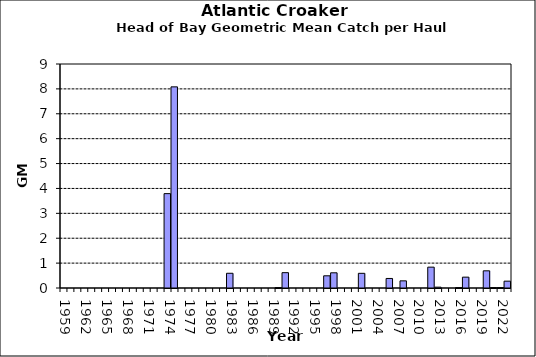
| Category | Series 0 |
|---|---|
| 1959.0 | 0 |
| 1960.0 | 0 |
| 1961.0 | 0 |
| 1962.0 | 0 |
| 1963.0 | 0 |
| 1964.0 | 0 |
| 1965.0 | 0 |
| 1966.0 | 0 |
| 1967.0 | 0 |
| 1968.0 | 0 |
| 1969.0 | 0 |
| 1970.0 | 0 |
| 1971.0 | 0 |
| 1972.0 | 0 |
| 1973.0 | 0 |
| 1974.0 | 3.792 |
| 1975.0 | 8.081 |
| 1976.0 | 0 |
| 1977.0 | 0 |
| 1978.0 | 0 |
| 1979.0 | 0 |
| 1980.0 | 0 |
| 1981.0 | 0 |
| 1982.0 | 0 |
| 1983.0 | 0.592 |
| 1984.0 | 0 |
| 1985.0 | 0 |
| 1986.0 | 0 |
| 1987.0 | 0 |
| 1988.0 | 0 |
| 1989.0 | 0 |
| 1990.0 | 0.017 |
| 1991.0 | 0.616 |
| 1992.0 | 0 |
| 1993.0 | 0 |
| 1994.0 | 0 |
| 1995.0 | 0 |
| 1996.0 | 0 |
| 1997.0 | 0.49 |
| 1998.0 | 0.611 |
| 1999.0 | 0 |
| 2000.0 | 0 |
| 2001.0 | 0 |
| 2002.0 | 0.59 |
| 2003.0 | 0 |
| 2004.0 | 0 |
| 2005.0 | 0 |
| 2006.0 | 0.383 |
| 2007.0 | 0 |
| 2008.0 | 0.287 |
| 2009.0 | 0 |
| 2010.0 | 0 |
| 2011.0 | 0 |
| 2012.0 | 0.838 |
| 2013.0 | 0.034 |
| 2014.0 | 0 |
| 2015.0 | 0 |
| 2016.0 | 0.017 |
| 2017.0 | 0.436 |
| 2018.0 | 0 |
| 2019.0 | 0 |
| 2020.0 | 0.69 |
| 2021.0 | 0.017 |
| 2022.0 | 0.017 |
| 2023.0 | 0.274 |